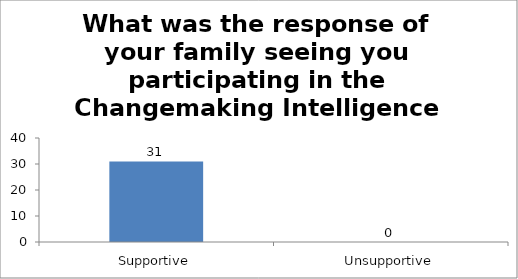
| Category | What was the response of your family seeing you participating in the Changemaking Intelligence Test? |
|---|---|
| Supportive | 31 |
| Unsupportive | 0 |